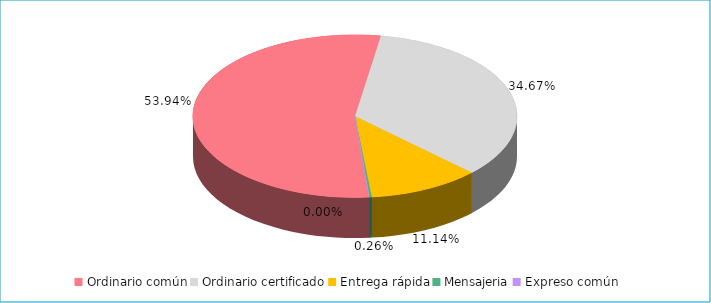
| Category | Series 0 |
|---|---|
| Ordinario común | 0.539 |
| Ordinario certificado | 0.347 |
| Entrega rápida | 0.111 |
| Mensajeria | 0.003 |
| Expreso común | 0 |